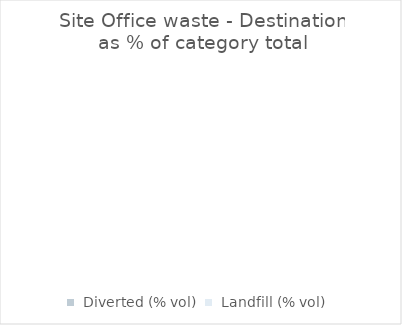
| Category |  Site office waste  |
|---|---|
|  Diverted (% vol)  | 0 |
|  Landfill (% vol)  | 0 |